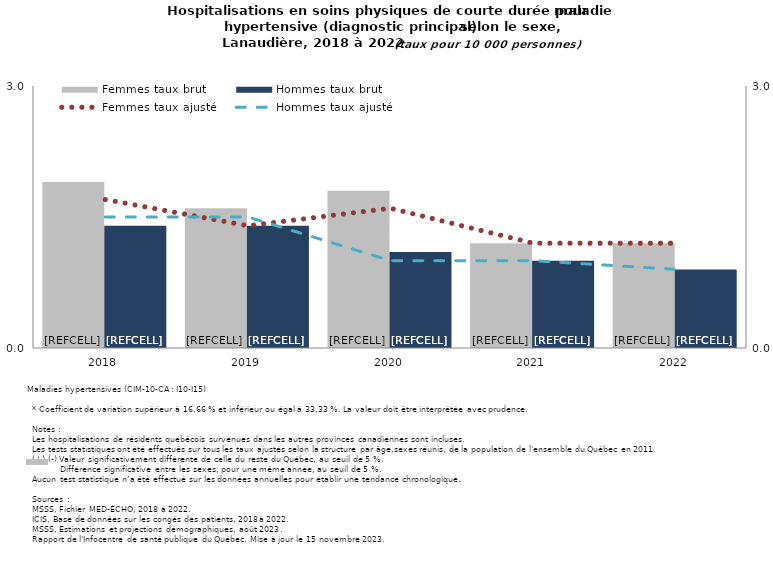
| Category | Femmes taux brut | Hommes taux brut |
|---|---|---|
| 2018.0 | 1.9 | 1.4 |
| 2019.0 | 1.6 | 1.4 |
| 2020.0 | 1.8 | 1.1 |
| 2021.0 | 1.2 | 1 |
| 2022.0 | 1.2 | 0.9 |